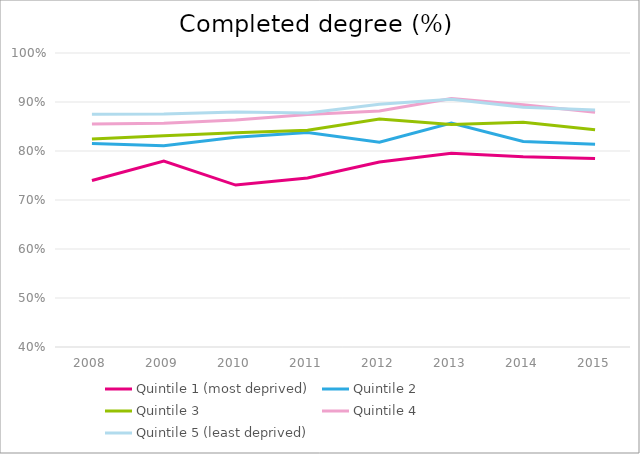
| Category | Quintile 1 (most deprived) | Quintile 2 | Quintile 3 | Quintile 4 | Quintile 5 (least deprived) |
|---|---|---|---|---|---|
| 2008.0 | 0.74 | 0.815 | 0.825 | 0.855 | 0.875 |
| 2009.0 | 0.78 | 0.811 | 0.831 | 0.857 | 0.876 |
| 2010.0 | 0.73 | 0.828 | 0.837 | 0.863 | 0.88 |
| 2011.0 | 0.745 | 0.838 | 0.843 | 0.875 | 0.878 |
| 2012.0 | 0.777 | 0.818 | 0.865 | 0.882 | 0.896 |
| 2013.0 | 0.795 | 0.857 | 0.854 | 0.907 | 0.906 |
| 2014.0 | 0.788 | 0.819 | 0.859 | 0.894 | 0.889 |
| 2015.0 | 0.785 | 0.814 | 0.843 | 0.879 | 0.884 |